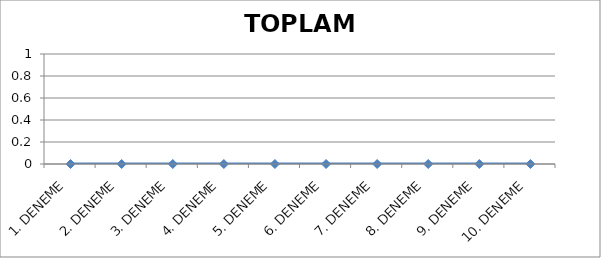
| Category | TOPLAM NET |
|---|---|
| 1. DENEME | 0 |
| 2. DENEME | 0 |
| 3. DENEME | 0 |
| 4. DENEME | 0 |
| 5. DENEME | 0 |
| 6. DENEME | 0 |
| 7. DENEME | 0 |
| 8. DENEME | 0 |
| 9. DENEME | 0 |
| 10. DENEME | 0 |